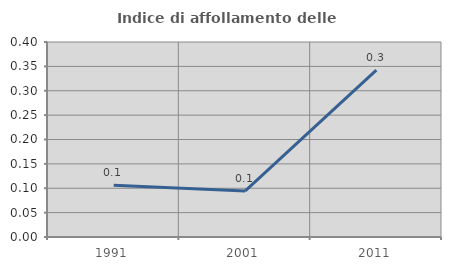
| Category | Indice di affollamento delle abitazioni  |
|---|---|
| 1991.0 | 0.106 |
| 2001.0 | 0.094 |
| 2011.0 | 0.342 |